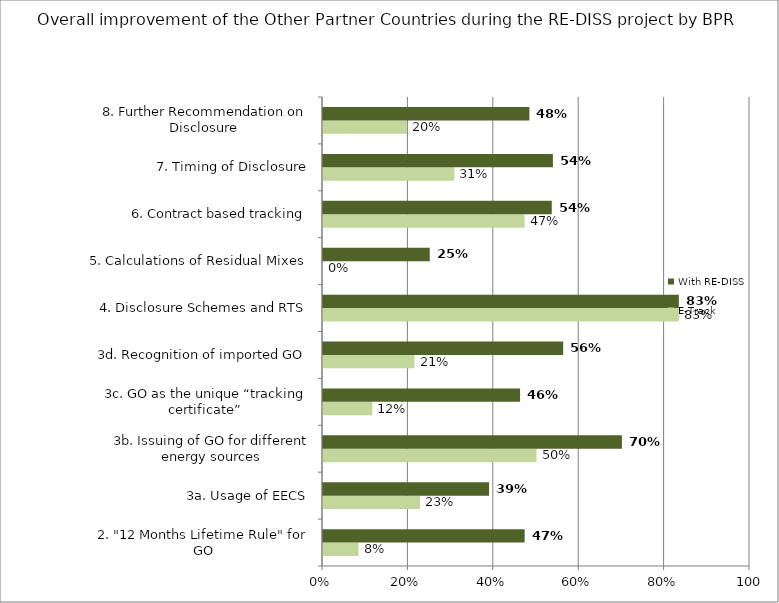
| Category | E-Track | With RE-DISS |
|---|---|---|
| 2. "12 Months Lifetime Rule" for GO | 0.083 | 0.472 |
| 3a. Usage of EECS | 0.227 | 0.389 |
| 3b. Issuing of GO for different energy sources | 0.5 | 0.7 |
| 3c. GO as the unique “tracking certificate”  | 0.115 | 0.462 |
| 3d. Recognition of imported GO | 0.214 | 0.562 |
| 4. Disclosure Schemes and RTS | 0.833 | 0.833 |
| 5. Calculations of Residual Mixes | 0 | 0.25 |
| 6. Contract based tracking | 0.472 | 0.536 |
| 7. Timing of Disclosure | 0.308 | 0.538 |
| 8. Further Recommendation on Disclosure  | 0.196 | 0.483 |